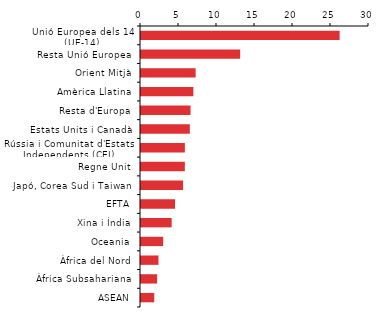
| Category | Series 0 |
|---|---|
| Unió Europea dels 14 (UE-14) | 26.135 |
| Resta Unió Europea | 13.047 |
| Orient Mitjà | 7.189 |
| Amèrica Llatina | 6.889 |
| Resta d'Europa | 6.522 |
| Estats Units i Canadà | 6.426 |
| Rússia i Comunitat d'Estats Independents (CEI) | 5.774 |
| Regne Unit | 5.769 |
| Japó, Corea Sud i Taiwan | 5.541 |
| EFTA | 4.48 |
| Xina i Índia | 4.037 |
| Oceania | 2.914 |
| Àfrica del Nord | 2.301 |
| Àfrica Subsahariana | 2.117 |
| ASEAN | 1.746 |